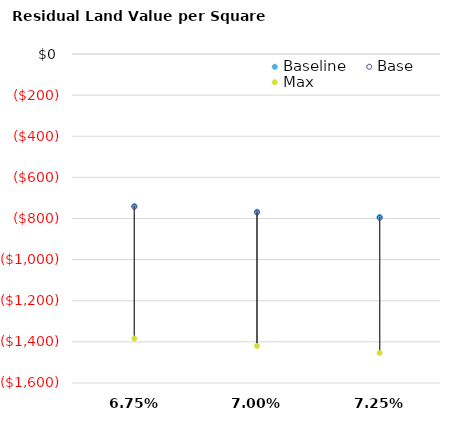
| Category | Baseline | Base | Max |
|---|---|---|---|
| 0.0675 | -739.109 | -743.203 | -1383.883 |
| 0.07 | -766.688 | -770.781 | -1420.029 |
| 0.07250000000000001 | -792.365 | -796.458 | -1453.681 |